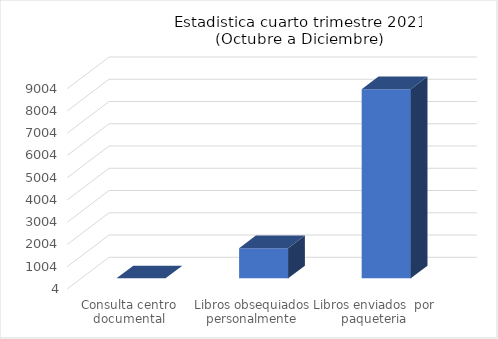
| Category | Abril a Junio |
|---|---|
| Consulta centro documental | 0 |
| Libros obsequiados personalmente | 1354 |
| Libros enviados  por paqueteria | 8500 |